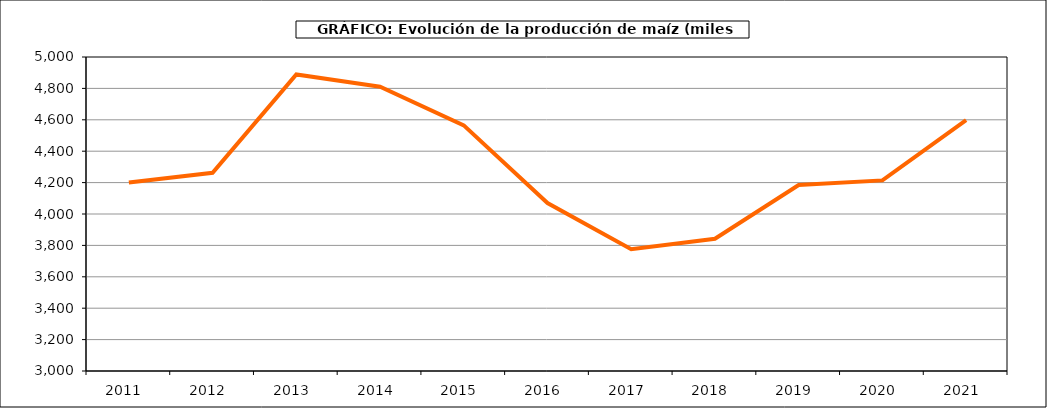
| Category | Superficie |
|---|---|
| 2011.0 | 4199.927 |
| 2012.0 | 4262.116 |
| 2013.0 | 4888.462 |
| 2014.0 | 4810.645 |
| 2015.0 | 4564.416 |
| 2016.0 | 4069.508 |
| 2017.0 | 3775.645 |
| 2018.0 | 3842.519 |
| 2019.0 | 4184.459 |
| 2020.0 | 4214.102 |
| 2021.0 | 4597.658 |